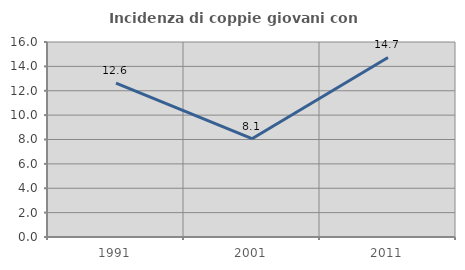
| Category | Incidenza di coppie giovani con figli |
|---|---|
| 1991.0 | 12.621 |
| 2001.0 | 8.065 |
| 2011.0 | 14.729 |